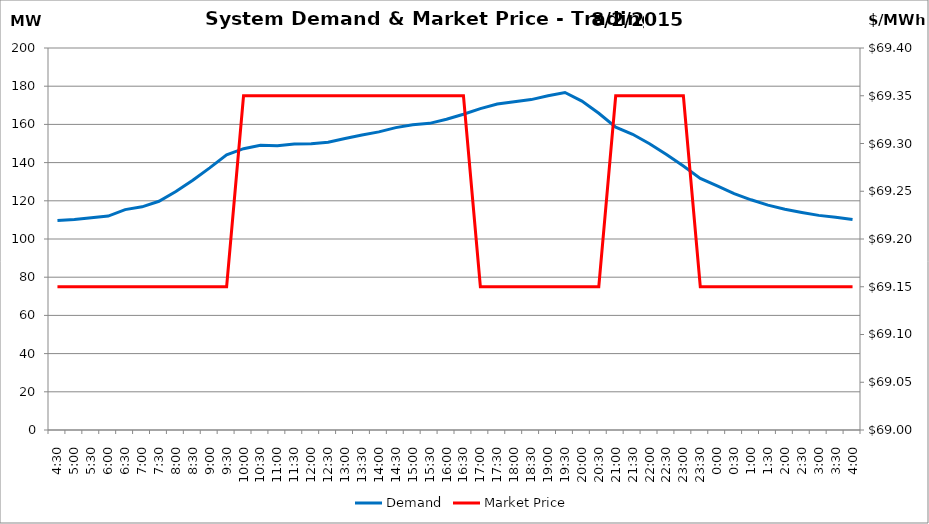
| Category | Demand |
|---|---|
| 0.1875 | 109.65 |
| 0.20833333333333334 | 110.16 |
| 0.22916666666666666 | 111.18 |
| 0.25 | 112 |
| 0.270833333333333 | 115.4 |
| 0.291666666666667 | 116.83 |
| 0.3125 | 119.75 |
| 0.333333333333333 | 124.83 |
| 0.354166666666667 | 130.79 |
| 0.375 | 137.25 |
| 0.395833333333333 | 144.09 |
| 0.416666666666667 | 147.3 |
| 0.4375 | 149.02 |
| 0.458333333333333 | 148.87 |
| 0.479166666666667 | 149.72 |
| 0.5 | 149.83 |
| 0.520833333333333 | 150.71 |
| 0.541666666666667 | 152.58 |
| 0.5625 | 154.43 |
| 0.583333333333333 | 156.07 |
| 0.604166666666667 | 158.31 |
| 0.625 | 159.86 |
| 0.645833333333334 | 160.55 |
| 0.666666666666667 | 162.7 |
| 0.6875 | 165.33 |
| 0.708333333333334 | 168.29 |
| 0.729166666666667 | 170.65 |
| 0.75 | 171.85 |
| 0.770833333333334 | 172.98 |
| 0.791666666666667 | 174.98 |
| 0.8125 | 176.69 |
| 0.833333333333334 | 172.22 |
| 0.854166666666667 | 165.83 |
| 0.875 | 158.59 |
| 0.895833333333334 | 154.81 |
| 0.916666666666667 | 149.9 |
| 0.9375 | 144.22 |
| 0.958333333333334 | 138.25 |
| 0.979166666666667 | 131.75 |
| 1900-01-01 | 127.76 |
| 1900-01-01 00:30:00 | 123.74 |
| 1900-01-01 01:00:00 | 120.53 |
| 1900-01-01 01:30:00 | 117.72 |
| 1900-01-01 02:00:00 | 115.54 |
| 1900-01-01 02:30:00 | 113.89 |
| 1900-01-01 03:00:00 | 112.37 |
| 1900-01-01 03:30:00 | 111.44 |
| 1900-01-01 04:00:00 | 110.23 |